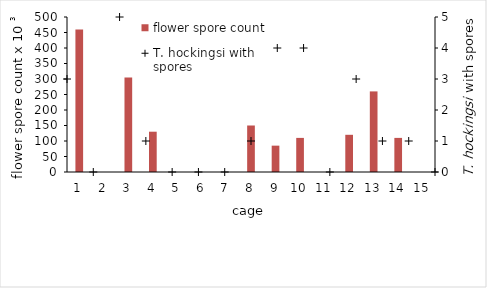
| Category | flower spore count |
|---|---|
| 0 | 460 |
| 1 | 0 |
| 2 | 305 |
| 3 | 130 |
| 4 | 0 |
| 5 | 0 |
| 6 | 0 |
| 7 | 150 |
| 8 | 85 |
| 9 | 110 |
| 10 | 0 |
| 11 | 120 |
| 12 | 260 |
| 13 | 110 |
| 14 | 0 |